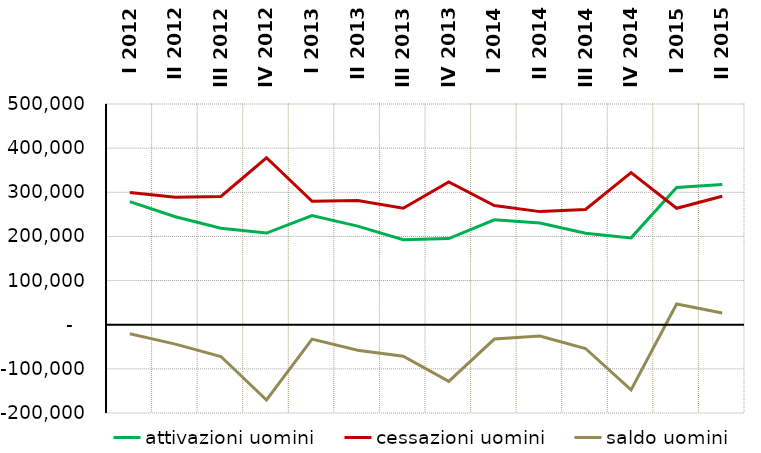
| Category | attivazioni uomini | cessazioni uomini | saldo uomini |
|---|---|---|---|
| I 2012 | 278811 | 299382 | -20571 |
| II 2012 | 244580 | 288501 | -43921 |
| III 2012 | 218639 | 290586 | -71947 |
| IV 2012 | 207638 | 378235 | -170597 |
| I 2013 | 247184 | 279737 | -32553 |
| II 2013 | 223309 | 281264 | -57955 |
| III 2013 | 192339 | 263712 | -71373 |
| IV 2013 | 195166 | 323494 | -128328 |
| I 2014 | 237509 | 269991 | -32482 |
| II 2014 | 230457 | 256205 | -25748 |
| III 2014 | 207349 | 261203 | -53854 |
| IV 2014 | 196722 | 344396 | -147674 |
| I 2015 | 310832 | 263834 | 46998 |
| II 2015 | 317613 | 291079 | 26534 |